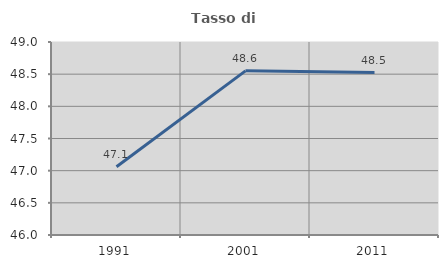
| Category | Tasso di occupazione   |
|---|---|
| 1991.0 | 47.06 |
| 2001.0 | 48.551 |
| 2011.0 | 48.525 |